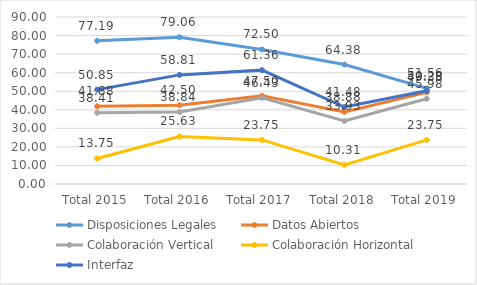
| Category | Disposiciones Legales | Datos Abiertos | Colaboración Vertical | Colaboración Horizontal | Interfaz |
|---|---|---|---|---|---|
| Total 2015 | 77.188 | 41.875 | 38.411 | 13.75 | 50.852 |
| Total 2016 | 79.062 | 42.5 | 38.839 | 25.625 | 58.807 |
| Total 2017 | 72.5 | 47.5 | 46.429 | 23.75 | 61.364 |
| Total 2018 | 64.375 | 38.875 | 33.929 | 10.312 | 41.477 |
| Total 2019 | 51.562 | 49.375 | 45.982 | 23.75 | 50.284 |